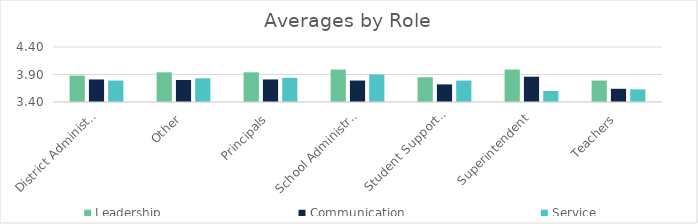
| Category | Leadership | Communication | Service |
|---|---|---|---|
| District Administrator | 3.88 | 3.81 | 3.79 |
| Other | 3.94 | 3.8 | 3.83 |
| Principals | 3.94 | 3.81 | 3.84 |
| School Administrators | 3.99 | 3.79 | 3.9 |
| Student Support Staff | 3.85 | 3.72 | 3.79 |
| Superintendent | 3.99 | 3.86 | 3.6 |
| Teachers | 3.79 | 3.64 | 3.63 |